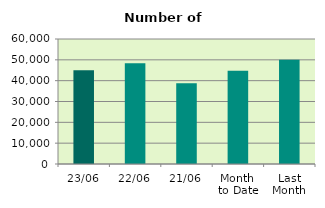
| Category | Series 0 |
|---|---|
| 23/06 | 44978 |
| 22/06 | 48390 |
| 21/06 | 38746 |
| Month 
to Date | 44728.706 |
| Last
Month | 50099.545 |